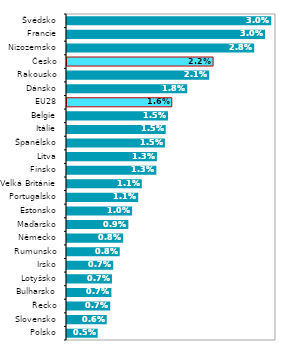
| Category | podíl na HDP |
|---|---|
| Polsko | 0.005 |
| Slovensko | 0.006 |
| Řecko | 0.007 |
| Bulharsko | 0.007 |
| Lotyšsko | 0.007 |
| Irsko | 0.007 |
| Rumunsko | 0.008 |
| Německo | 0.008 |
| Maďarsko | 0.009 |
| Estonsko | 0.01 |
| Portugalsko | 0.011 |
| Velká Británie | 0.011 |
| Finsko | 0.013 |
| Litva | 0.013 |
| Španělsko | 0.015 |
| Itálie | 0.015 |
| Belgie | 0.015 |
| EU28 | 0.016 |
| Dánsko | 0.018 |
| Rakousko | 0.021 |
| Česko | 0.022 |
| Nizozemsko | 0.028 |
| Francie | 0.03 |
| Švédsko | 0.03 |